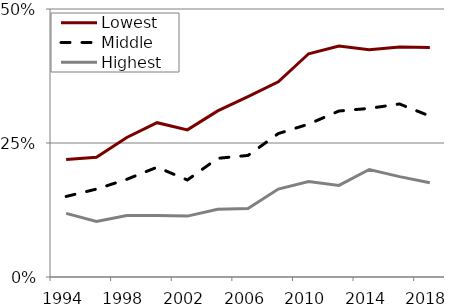
| Category | Lowest | Middle | Highest |
|---|---|---|---|
| 1994.0 | 0.219 | 0.15 | 0.119 |
| 1996.0 | 0.223 | 0.164 | 0.104 |
| 1998.0 | 0.26 | 0.182 | 0.115 |
| 2000.0 | 0.288 | 0.205 | 0.115 |
| 2002.0 | 0.274 | 0.181 | 0.114 |
| 2004.0 | 0.31 | 0.221 | 0.126 |
| 2006.0 | 0.337 | 0.227 | 0.128 |
| 2008.0 | 0.364 | 0.268 | 0.164 |
| 2010.0 | 0.417 | 0.285 | 0.178 |
| 2012.0 | 0.431 | 0.31 | 0.171 |
| 2014.0 | 0.424 | 0.315 | 0.201 |
| 2016.0 | 0.429 | 0.323 | 0.187 |
| 2018.0 | 0.428 | 0.3 | 0.176 |